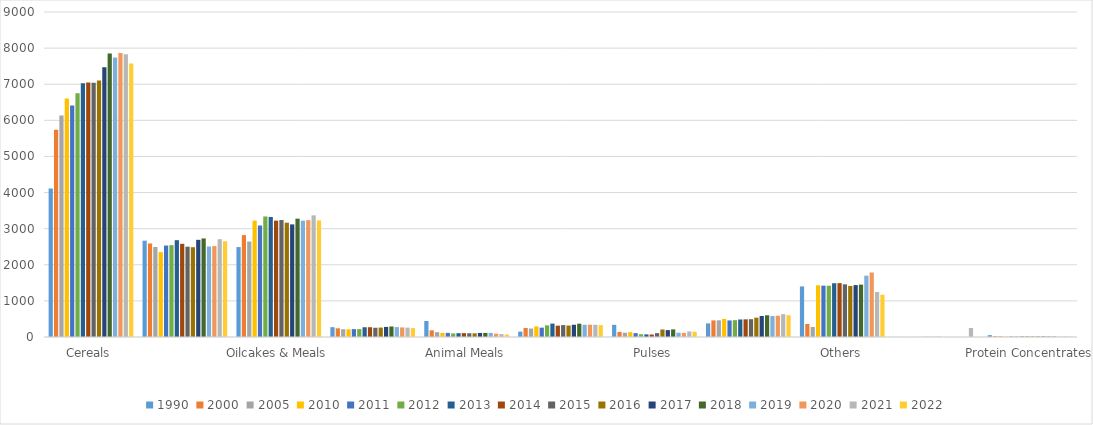
| Category | 1990 | 2000 | 2005 | 2010 | 2011 | 2012 | 2013 | 2014 | 2015 | 2016 | 2017 | 2018 | 2019 | 2020 | 2021 | 2022 |
|---|---|---|---|---|---|---|---|---|---|---|---|---|---|---|---|---|
| Cereals | 4114 | 5741 | 6132 | 6602 | 6412 | 6749 | 7026 | 7045 | 7044 | 7105 | 7471 | 7853 | 7742 | 7868 | 7828 | 7571 |
| By-Products of the Food Industry | 2667 | 2590 | 2492 | 2350 | 2533 | 2543 | 2681 | 2580 | 2501 | 2487 | 2691 | 2729 | 2506 | 2518 | 2708 | 2651 |
| Oilcakes & Meals | 2490 | 2821 | 2643 | 3224 | 3087 | 3338 | 3324 | 3222 | 3239 | 3166 | 3118 | 3277 | 3223 | 3236 | 3369.1 | 3230 |
| Oils & Fats | 272 | 241 | 215 | 213 | 218 | 219 | 270 | 271 | 256 | 261 | 279 | 291 | 274 | 265 | 260 | 247 |
| Animal Meals | 443 | 185 | 134 | 113 | 114 | 99 | 106 | 107 | 104 | 102 | 112 | 113 | 113 | 93 | 81 | 71 |
| Dried Forages & Sugar Beet Pulp
 | 149 | 250 | 234 | 294 | 259 | 323 | 371 | 315 | 330 | 317 | 339 | 368 | 339 | 341 | 339 | 330 |
| Pulses | 337 | 140 | 119 | 135 | 107 | 77 | 72 | 69 | 107 | 208 | 191 | 211 | 117 | 113 | 154 | 144 |
| Additives, Minerals & Vitamins | 377 | 460 | 462 | 502 | 459 | 466 | 485 | 489 | 493 | 535 | 582 | 602 | 580 | 589 | 632 | 603 |
| Others | 1401 | 360 | 277 | 1433 | 1422 | 1420 | 1489 | 1492 | 1459 | 1414 | 1437 | 1450 | 1698 | 1786 | 1245 | 1169 |
| Manioc | 3 | 0 | 0 | 2 | 1 | 3 | 4 | 2 | 4 | 0 | 0 | 0 | 0 | 0 | 250 | 0 |
| Protein Concentrates | 51 | 21 | 21 | 13 | 13 | 13 | 13 | 13 | 13 | 15 | 13 | 11 | 22 | 7 | 13 | 11 |